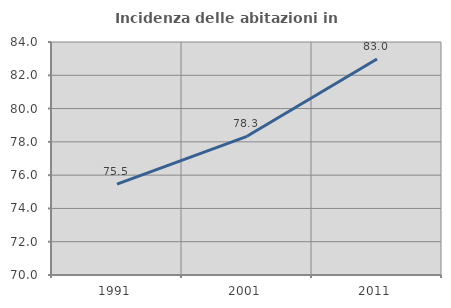
| Category | Incidenza delle abitazioni in proprietà  |
|---|---|
| 1991.0 | 75.461 |
| 2001.0 | 78.335 |
| 2011.0 | 82.981 |